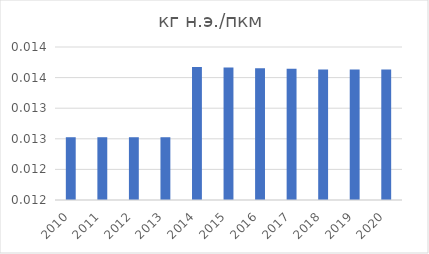
| Category | кг н.э./пкм |
|---|---|
| 2010.0 | 0.013 |
| 2011.0 | 0.013 |
| 2012.0 | 0.013 |
| 2013.0 | 0.013 |
| 2014.0 | 0.014 |
| 2015.0 | 0.014 |
| 2016.0 | 0.014 |
| 2017.0 | 0.014 |
| 2018.0 | 0.014 |
| 2019.0 | 0.014 |
| 2020.0 | 0.014 |